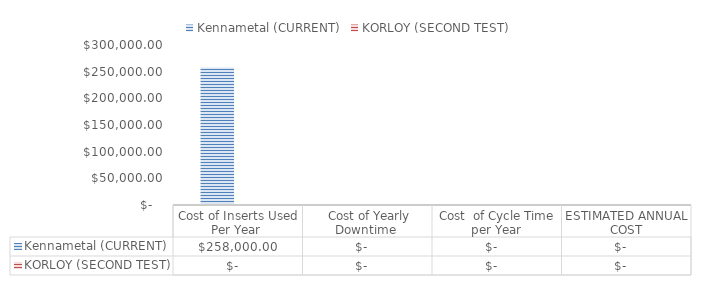
| Category | Kennametal (CURRENT) | KORLOY (SECOND TEST) |
|---|---|---|
| Cost of Inserts Used Per Year  | 258000 | 0 |
|  Cost of Yearly Downtime  | 0 | 0 |
| Cost  of Cycle Time per Year | 0 | 0 |
| ESTIMATED ANNUAL COST | 0 | 0 |